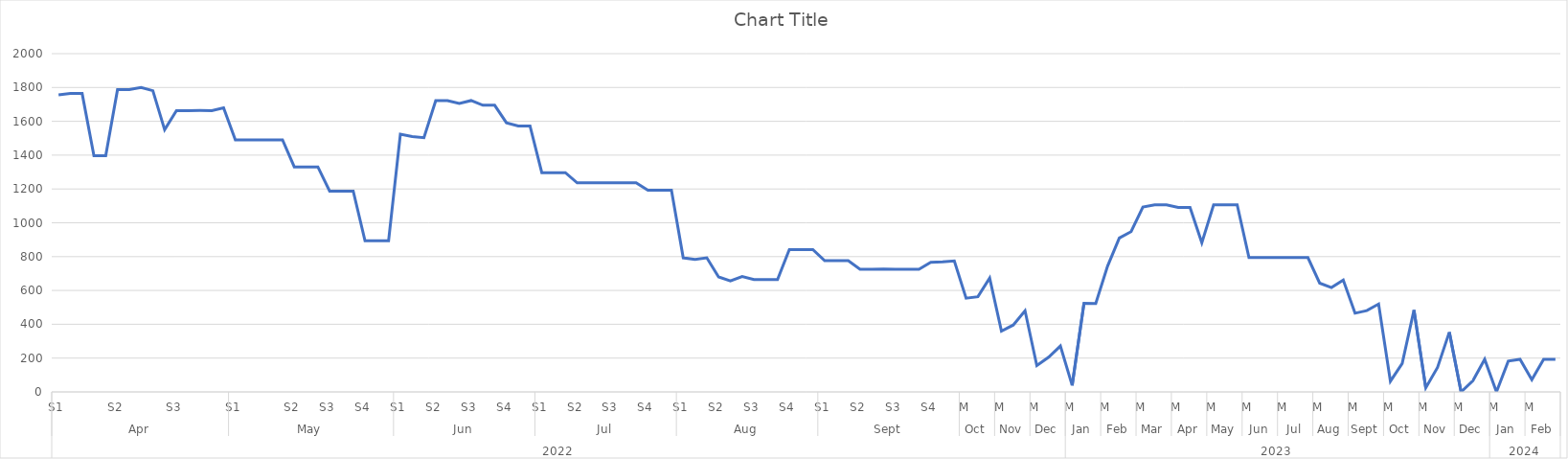
| Category | Series 0 |
|---|---|
| 0 | 1757.02 |
| 1 | 1764.22 |
| 2 | 1764.22 |
| 3 | 1396.52 |
| 4 | 1396.52 |
| 5 | 1786.88 |
| 6 | 1787.13 |
| 7 | 1799.8 |
| 8 | 1781.09 |
| 9 | 1550.14 |
| 10 | 1663.44 |
| 11 | 1663.44 |
| 12 | 1664 |
| 13 | 1663.44 |
| 14 | 1679.34 |
| 15 | 1490.65 |
| 16 | 1490.65 |
| 17 | 1490.65 |
| 18 | 1490.65 |
| 19 | 1490.65 |
| 20 | 1330.46 |
| 21 | 1330.46 |
| 22 | 1330.46 |
| 23 | 1187.37 |
| 24 | 1187.37 |
| 25 | 1187.37 |
| 26 | 893.55 |
| 27 | 893.55 |
| 28 | 893.55 |
| 29 | 1523.92 |
| 30 | 1509.81 |
| 31 | 1502.81 |
| 32 | 1722.69 |
| 33 | 1722.69 |
| 34 | 1705.72 |
| 35 | 1722.69 |
| 36 | 1694.96 |
| 37 | 1694.96 |
| 38 | 1591.55 |
| 39 | 1572.33 |
| 40 | 1572.33 |
| 41 | 1296.68 |
| 42 | 1296.68 |
| 43 | 1296.68 |
| 44 | 1236.3 |
| 45 | 1236.3 |
| 46 | 1236.3 |
| 47 | 1236.3 |
| 48 | 1236.3 |
| 49 | 1236.3 |
| 50 | 1192.14 |
| 51 | 1192.14 |
| 52 | 1192.14 |
| 53 | 792.83 |
| 54 | 783.26 |
| 55 | 792.83 |
| 56 | 679.75 |
| 57 | 655.69 |
| 58 | 682.74 |
| 59 | 664.62 |
| 60 | 664.62 |
| 61 | 664.62 |
| 62 | 841.72 |
| 63 | 841.72 |
| 64 | 841.72 |
| 65 | 775.57 |
| 66 | 775.57 |
| 67 | 776.14 |
| 68 | 725.79 |
| 69 | 725.79 |
| 70 | 726.77 |
| 71 | 725.56 |
| 72 | 725.56 |
| 73 | 725.56 |
| 74 | 766.75 |
| 75 | 768.52 |
| 76 | 774.13 |
| 77 | 554.22 |
| 78 | 562.96 |
| 79 | 673.43 |
| 80 | 359.41 |
| 81 | 395.49 |
| 82 | 480.01 |
| 83 | 156.08 |
| 84 | 204.89 |
| 85 | 271.46 |
| 86 | 38.59 |
| 87 | 523.34 |
| 88 | 522.63 |
| 89 | 743.18 |
| 90 | 909.86 |
| 91 | 947.54 |
| 92 | 1093.01 |
| 93 | 1106.49 |
| 94 | 1106.49 |
| 95 | 1090.87 |
| 96 | 1090.87 |
| 97 | 881.93 |
| 98 | 1106.49 |
| 99 | 1106.49 |
| 100 | 1106.49 |
| 101 | 794.03 |
| 102 | 794.03 |
| 103 | 794.03 |
| 104 | 794.03 |
| 105 | 794.03 |
| 106 | 794.03 |
| 107 | 643.38 |
| 108 | 617.04 |
| 109 | 660.88 |
| 110 | 465.36 |
| 111 | 480.74 |
| 112 | 519.82 |
| 113 | 63.22 |
| 114 | 168.15 |
| 115 | 484.09 |
| 116 | 24.3 |
| 117 | 145.11 |
| 118 | 353.3 |
| 119 | 0 |
| 120 | 66.08 |
| 121 | 192.66 |
| 122 | 0 |
| 123 | 182.13 |
| 124 | 192.66 |
| 125 | 72.3 |
| 126 | 192.66 |
| 127 | 192.66 |